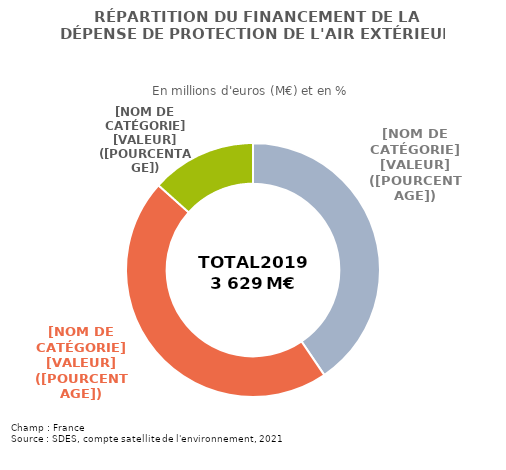
| Category | Series 0 |
|---|---|
| Administrations publiques | 1470.026 |
| Entreprises | 1673.896 |
| Ménages | 485.287 |